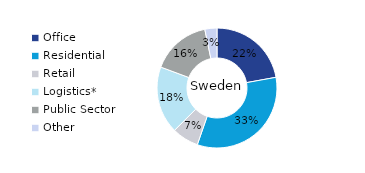
| Category | Sweden |
|---|---|
| Office | 0.221 |
| Residential | 0.332 |
| Retail | 0.072 |
| Logistics* | 0.181 |
| Public Sector | 0.161 |
| Other | 0.033 |